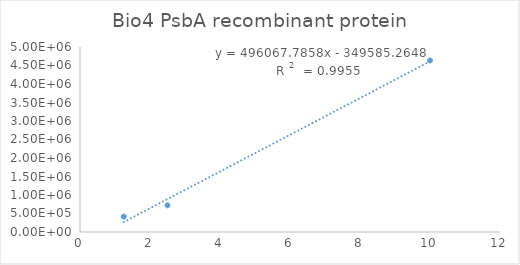
| Category | Series 0 |
|---|---|
| 10.0 | 4635159 |
| 2.5 | 722119.35 |
| 1.25 | 414897.91 |